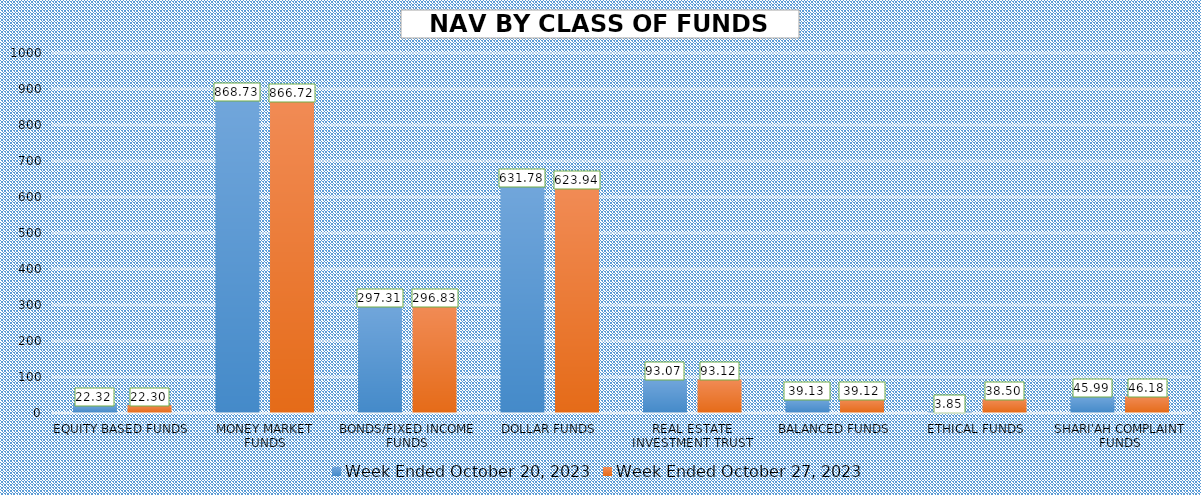
| Category | Week Ended October 20, 2023 | Week Ended October 27, 2023 |
|---|---|---|
| EQUITY BASED FUNDS | 22.321 | 22.297 |
| MONEY MARKET FUNDS | 868.733 | 866.72 |
| BONDS/FIXED INCOME FUNDS | 297.315 | 296.83 |
| DOLLAR FUNDS | 631.779 | 623.939 |
| REAL ESTATE INVESTMENT TRUST | 93.072 | 93.122 |
| BALANCED FUNDS | 39.126 | 39.115 |
| ETHICAL FUNDS | 3.852 | 38.502 |
| SHARI'AH COMPLAINT FUNDS | 45.994 | 46.179 |